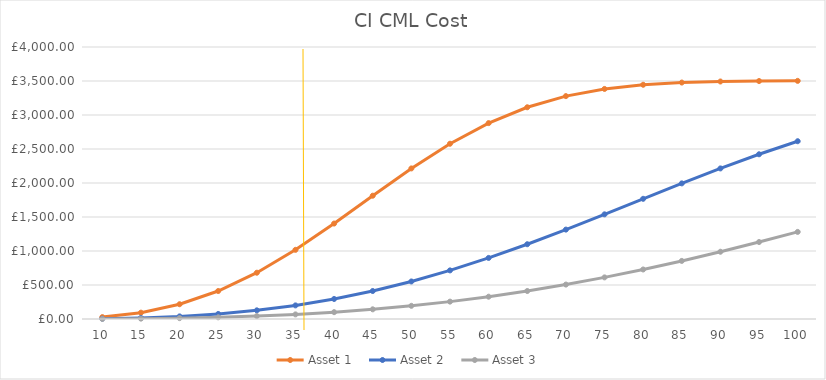
| Category | Asset 1 | Asset 2 | Asset 3 |
|---|---|---|---|
| 10.0 | 27.913 | 4.802 | 1.594 |
| 15.0 | 93.317 | 16.18 | 5.377 |
| 20.0 | 217.171 | 38.232 | 12.733 |
| 25.0 | 411.618 | 74.283 | 24.825 |
| 30.0 | 680.517 | 127.369 | 42.787 |
| 35.0 | 1017.15 | 200.084 | 67.7 |
| 40.0 | 1403.684 | 294.424 | 100.574 |
| 45.0 | 1813.206 | 411.618 | 142.324 |
| 50.0 | 2214.345 | 551.983 | 193.744 |
| 55.0 | 2577.493 | 714.809 | 255.484 |
| 60.0 | 2880.764 | 898.295 | 328.016 |
| 65.0 | 3113.728 | 1099.564 | 411.618 |
| 70.0 | 3277.753 | 1314.744 | 506.348 |
| 75.0 | 3383.175 | 1539.151 | 612.025 |
| 80.0 | 3444.755 | 1767.535 | 728.22 |
| 85.0 | 3477.294 | 1994.399 | 854.252 |
| 90.0 | 3492.771 | 2214.345 | 989.192 |
| 95.0 | 3499.364 | 2422.423 | 1131.872 |
| 100.0 | 3501.867 | 2614.444 | 1280.914 |